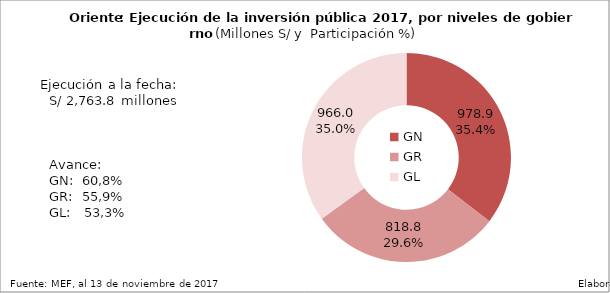
| Category | Ejecutado |
|---|---|
| GN | 978.928 |
| GR | 818.849 |
| GL | 965.996 |